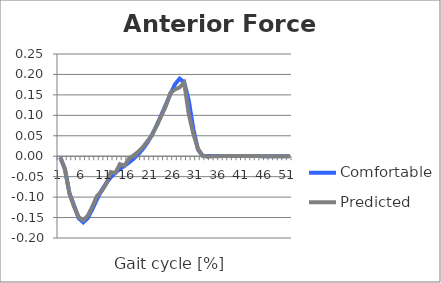
| Category | Comfortable | Predicted |
|---|---|---|
| 0 | -0.003 | -0.003 |
| 1 | -0.031 | -0.031 |
| 2 | -0.091 | -0.091 |
| 3 | -0.12 | -0.124 |
| 4 | -0.152 | -0.149 |
| 5 | -0.162 | -0.157 |
| 6 | -0.151 | -0.145 |
| 7 | -0.129 | -0.123 |
| 8 | -0.105 | -0.097 |
| 9 | -0.084 | -0.086 |
| 10 | -0.066 | -0.068 |
| 11 | -0.052 | -0.039 |
| 12 | -0.04 | -0.041 |
| 13 | -0.031 | -0.019 |
| 14 | -0.023 | -0.023 |
| 15 | -0.015 | -0.005 |
| 16 | -0.006 | 0.002 |
| 17 | 0.005 | 0.011 |
| 18 | 0.018 | 0.022 |
| 19 | 0.034 | 0.037 |
| 20 | 0.053 | 0.051 |
| 21 | 0.076 | 0.074 |
| 22 | 0.1 | 0.098 |
| 23 | 0.126 | 0.122 |
| 24 | 0.152 | 0.155 |
| 25 | 0.176 | 0.163 |
| 26 | 0.19 | 0.168 |
| 27 | 0.181 | 0.18 |
| 28 | 0.137 | 0.103 |
| 29 | 0.067 | 0.055 |
| 30 | 0.016 | 0.019 |
| 31 | 0.001 | 0.001 |
| 32 | 0 | -0.001 |
| 33 | 0 | 0 |
| 34 | 0 | 0 |
| 35 | 0 | 0 |
| 36 | 0 | 0 |
| 37 | 0 | 0 |
| 38 | 0 | 0 |
| 39 | 0 | 0 |
| 40 | 0 | 0 |
| 41 | 0 | 0 |
| 42 | 0 | 0 |
| 43 | 0 | 0 |
| 44 | 0 | 0 |
| 45 | 0 | 0 |
| 46 | 0 | 0 |
| 47 | 0 | 0 |
| 48 | 0 | 0 |
| 49 | 0 | 0 |
| 50 | 0 | 0 |